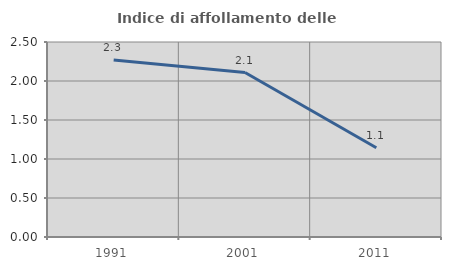
| Category | Indice di affollamento delle abitazioni  |
|---|---|
| 1991.0 | 2.268 |
| 2001.0 | 2.109 |
| 2011.0 | 1.145 |